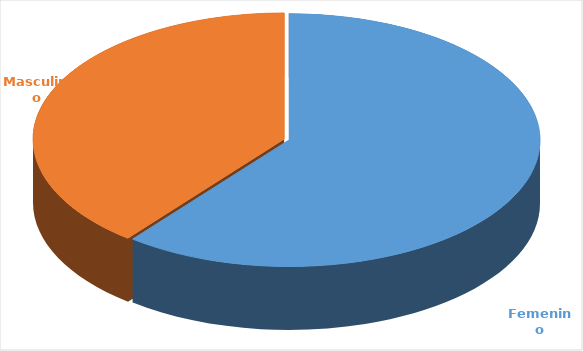
| Category | Cantidad  |
|---|---|
| Femenino | 3572 |
| Masculino | 2315 |